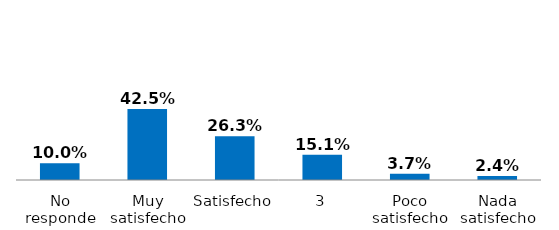
| Category | Series 0 |
|---|---|
| Nada satisfecho | 0.024 |
| Poco satisfecho | 0.037 |
| 3 | 0.151 |
| Satisfecho | 0.263 |
| Muy satisfecho | 0.425 |
| No responde | 0.1 |